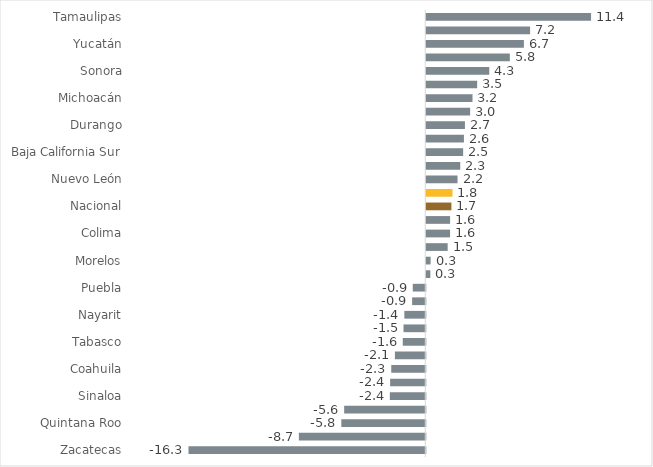
| Category | Series 0 |
|---|---|
| Zacatecas | -16.315 |
| Chiapas | -8.71 |
| Quintana Roo | -5.784 |
| Oaxaca | -5.589 |
| Sinaloa | -2.442 |
| Hidalgo | -2.422 |
| Coahuila | -2.344 |
| Veracruz | -2.094 |
| Tabasco | -1.552 |
| Guerrero | -1.501 |
| Nayarit | -1.443 |
| Estado de México | -0.906 |
| Puebla | -0.863 |
| Querétaro | 0.281 |
| Morelos | 0.298 |
| San Luis Potosí | 1.472 |
| Colima | 1.639 |
| Guanajuato | 1.641 |
| Nacional | 1.731 |
| Jalisco | 1.805 |
| Nuevo León | 2.152 |
| Ciudad de México | 2.34 |
| Baja California Sur | 2.539 |
| Baja California | 2.593 |
| Durango | 2.663 |
| Chihuahua | 3.022 |
| Michoacán | 3.184 |
| Tlaxcala | 3.504 |
| Sonora | 4.339 |
| Aguascalientes | 5.756 |
| Yucatán | 6.726 |
| Campeche | 7.152 |
| Tamaulipas | 11.353 |